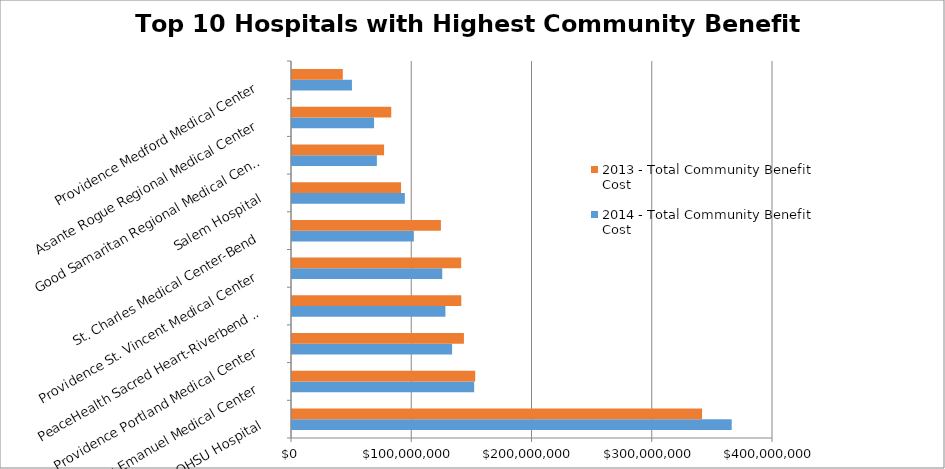
| Category | 2014 - Total Community Benefit Cost | 2013 - Total Community Benefit Cost |
|---|---|---|
| OHSU Hospital | 365653676 | 341020625 |
| Legacy Emanuel Medical Center | 151501923 | 152374462 |
| Providence Portland Medical Center | 133134716 | 142984211 |
| PeaceHealth Sacred Heart-Riverbend & University  | 127585677 | 140780672 |
| Providence St. Vincent Medical Center | 124953087 | 140705794 |
| St. Charles Medical Center-Bend | 101331817 | 123833675 |
| Salem Hospital | 93829403 | 90704776 |
| Good Samaritan Regional Medical Center | 70586338 | 76556109 |
| Asante Rogue Regional Medical Center | 68227657 | 82546040 |
| Providence Medford Medical Center | 49855412 | 42248126 |